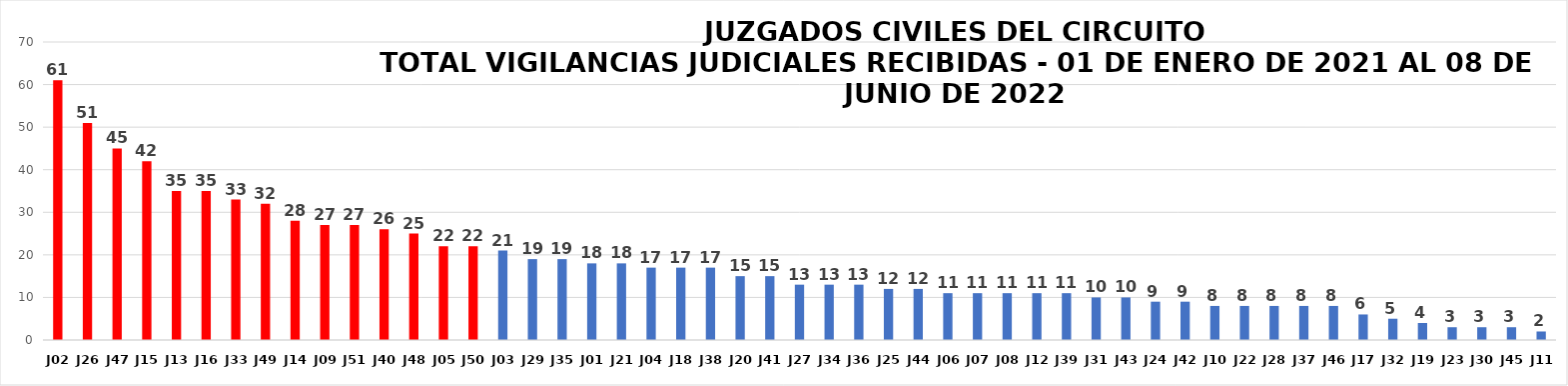
| Category | # VIGILANCIAS |
|---|---|
| J02 | 61 |
| J26 | 51 |
| J47 | 45 |
| J15 | 42 |
| J13 | 35 |
| J16 | 35 |
| J33 | 33 |
| J49 | 32 |
| J14 | 28 |
| J09 | 27 |
| J51 | 27 |
| J40 | 26 |
| J48 | 25 |
| J05 | 22 |
| J50 | 22 |
| J03 | 21 |
| J29 | 19 |
| J35 | 19 |
| J01 | 18 |
| J21 | 18 |
| J04 | 17 |
| J18 | 17 |
| J38 | 17 |
| J20 | 15 |
| J41 | 15 |
| J27 | 13 |
| J34 | 13 |
| J36 | 13 |
| J25 | 12 |
| J44 | 12 |
| J06 | 11 |
| J07 | 11 |
| J08 | 11 |
| J12 | 11 |
| J39 | 11 |
| J31 | 10 |
| J43 | 10 |
| J24 | 9 |
| J42 | 9 |
| J10 | 8 |
| J22 | 8 |
| J28 | 8 |
| J37 | 8 |
| J46 | 8 |
| J17 | 6 |
| J32 | 5 |
| J19 | 4 |
| J23 | 3 |
| J30 | 3 |
| J45 | 3 |
| J11 | 2 |